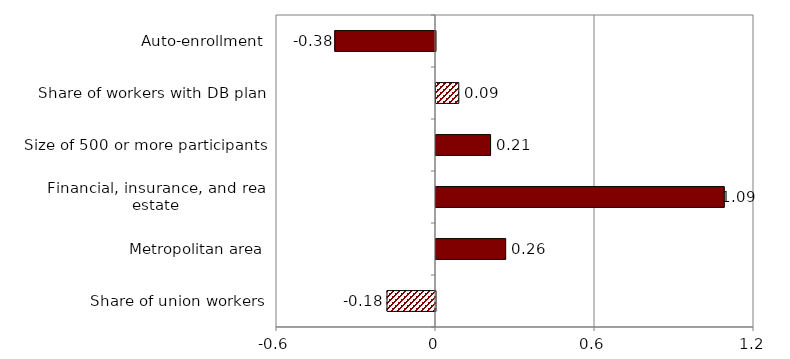
| Category | Series 0 |
|---|---|
| Share of union workers | -0.183 |
| Metropolitan area | 0.263 |
| Financial, insurance, and real estate | 1.088 |
| Size of 500 or more participants | 0.206 |
| Share of workers with DB plan | 0.086 |
| Auto-enrollment | -0.38 |